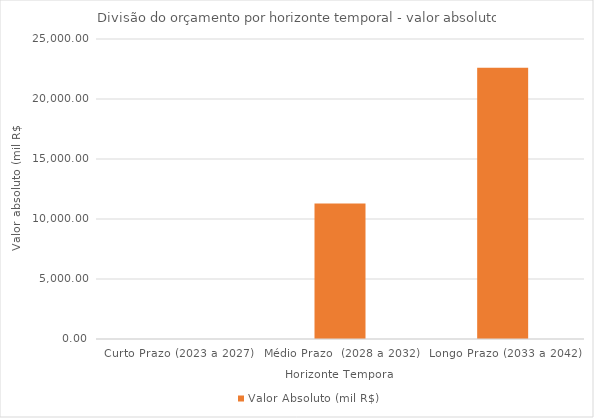
| Category | Valor Absoluto (mil R$) |
|---|---|
| Curto Prazo (2023 a 2027) | 0 |
| Médio Prazo  (2028 a 2032) | 11300 |
| Longo Prazo (2033 a 2042) | 22600 |